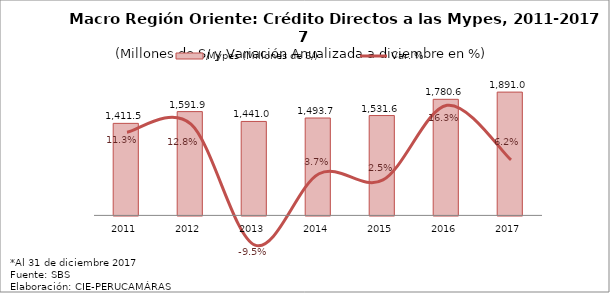
| Category | Mypes (Millones de S/) |
|---|---|
| 2011.0 | 1411.468 |
| 2012.0 | 1591.862 |
| 2013.0 | 1440.979 |
| 2014.0 | 1493.716 |
| 2015.0 | 1531.564 |
| 2016.0 | 1780.589 |
| 2017.0 | 1890.996 |